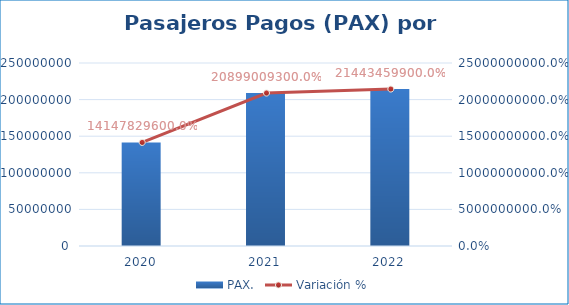
| Category | PAX. |
|---|---|
| 2020 | 141478296 |
| 2021 | 208990093 |
| 2022 | 214434599 |